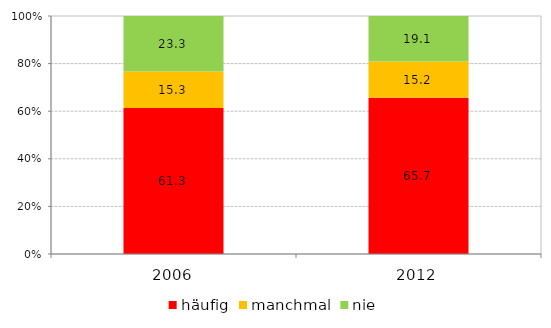
| Category | häufig | manchmal | nie |
|---|---|---|---|
| 2006.0 | 61.3 | 15.3 | 23.3 |
| 2012.0 | 65.7 | 15.2 | 19.1 |